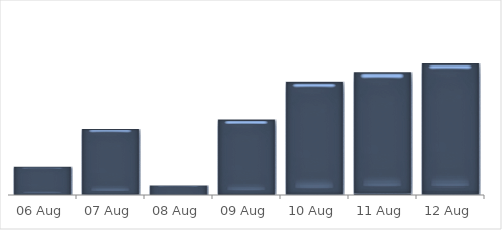
| Category | Figures |
|---|---|
| 2019-08-06 | 3 |
| 2019-08-07 | 7 |
| 2019-08-08 | 1 |
| 2019-08-09 | 8 |
| 2019-08-10 | 12 |
| 2019-08-11 | 13 |
| 2019-08-12 | 14 |